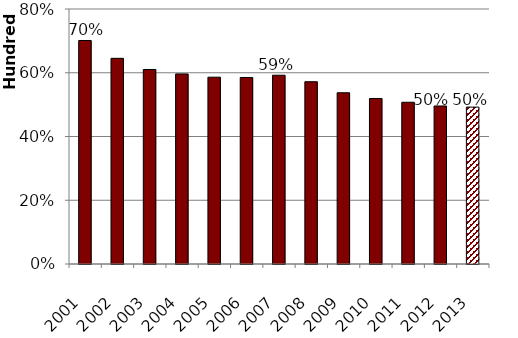
| Category | Act FR - Riskless |
|---|---|
| 2001.0 | 70.119 |
| 2002.0 | 64.528 |
| 2003.0 | 61.021 |
| 2004.0 | 59.626 |
| 2005.0 | 58.607 |
| 2006.0 | 58.514 |
| 2007.0 | 59.225 |
| 2008.0 | 57.184 |
| 2009.0 | 53.721 |
| 2010.0 | 51.929 |
| 2011.0 | 50.739 |
| 2012.0 | 49.574 |
| 2013.0 | 49.223 |